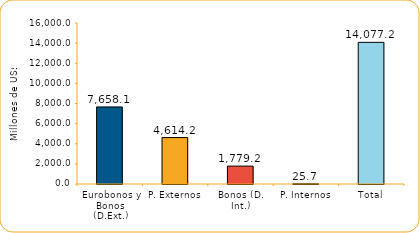
| Category | Series 1 |
|---|---|
| Eurobonos y Bonos (D.Ext.) | 7658.1 |
| P. Externos | 4614.2 |
| Bonos (D. Int.) | 1779.2 |
| P. Internos | 25.7 |
| Total | 14077.2 |